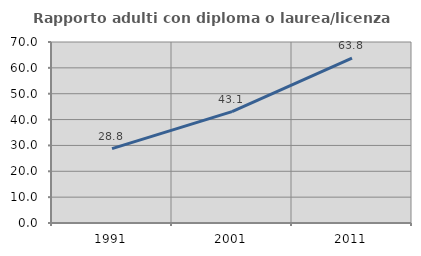
| Category | Rapporto adulti con diploma o laurea/licenza media  |
|---|---|
| 1991.0 | 28.763 |
| 2001.0 | 43.077 |
| 2011.0 | 63.793 |